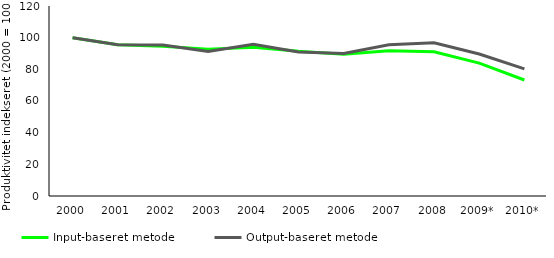
| Category | Input-baseret metode | Output-baseret metode |
|---|---|---|
| 2000 | 100 | 100 |
| 2001 | 95.573 | 95.51 |
| 2002 | 94.617 | 95.325 |
| 2003 | 92.615 | 91.345 |
| 2004 | 93.972 | 95.842 |
| 2005 | 91.358 | 90.899 |
| 2006 | 89.529 | 89.968 |
| 2007 | 91.79 | 95.524 |
| 2008 | 91.08 | 96.817 |
| 2009* | 83.939 | 89.7 |
| 2010* | 73.27 | 80.325 |